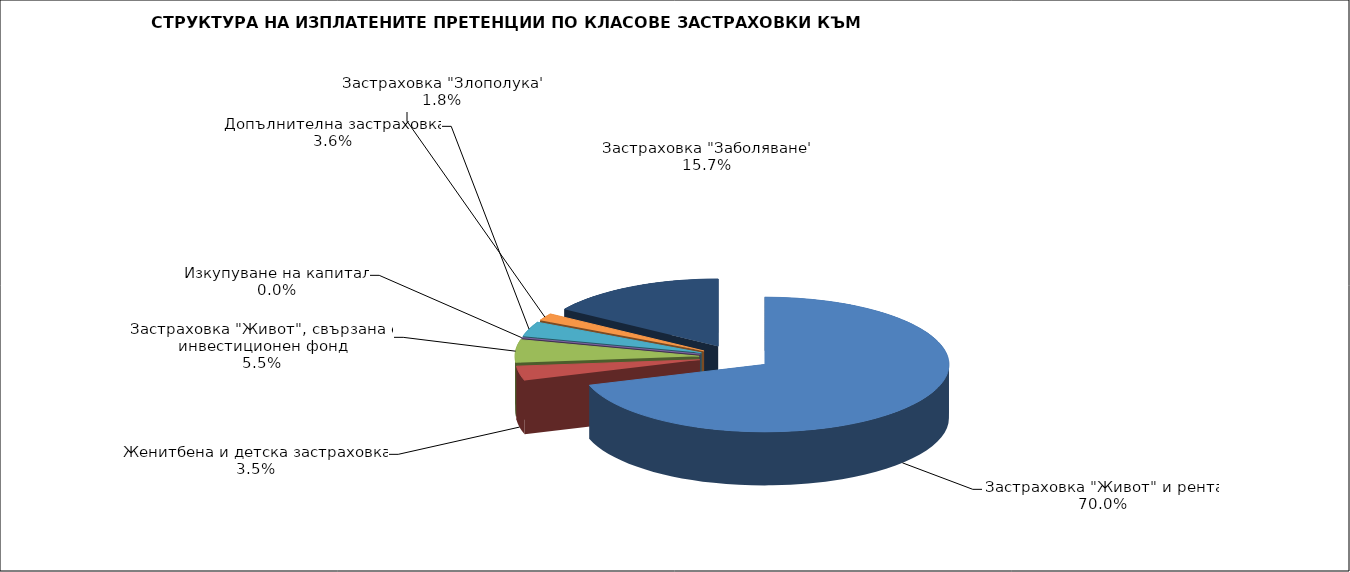
| Category | 8 476 099 |
|---|---|
| Застраховка "Живот" и рента | 8476098.779 |
| Женитбена и детска застраховка | 417830.673 |
| Застраховка "Живот", свързана с инвестиционен фонд | 664084.591 |
| Изкупуване на капитал | 0 |
| Допълнителна застраховка | 432256.48 |
| Застраховка "Злополука" | 213240.32 |
| Застраховка "Заболяване" | 1903415.452 |